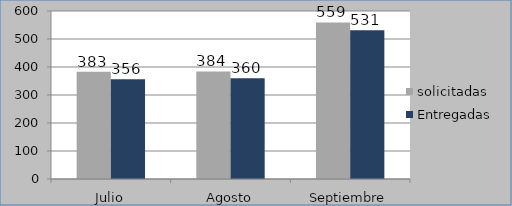
| Category | solicitadas | Entregadas |
|---|---|---|
| Julio | 383 | 356 |
| Agosto | 384 | 360 |
| Septiembre | 559 | 531 |